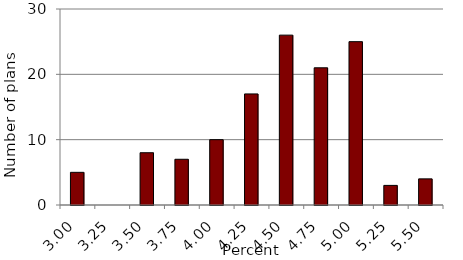
| Category | Series 0 |
|---|---|
| 3.0 | 5 |
| 3.25 | 0 |
| 3.5 | 8 |
| 3.75 | 7 |
| 4.0 | 10 |
| 4.25 | 17 |
| 4.5 | 26 |
| 4.75 | 21 |
| 5.0 | 25 |
| 5.25 | 3 |
| 5.5 | 4 |